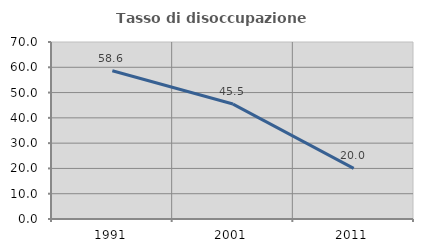
| Category | Tasso di disoccupazione giovanile  |
|---|---|
| 1991.0 | 58.621 |
| 2001.0 | 45.455 |
| 2011.0 | 20 |